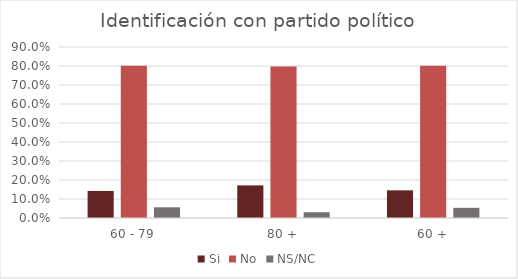
| Category | Si | No | NS/NC |
|---|---|---|---|
| 60 - 79 | 0.142 | 0.801 | 0.056 |
| 80 + | 0.172 | 0.798 | 0.03 |
| 60 + | 0.146 | 0.801 | 0.054 |